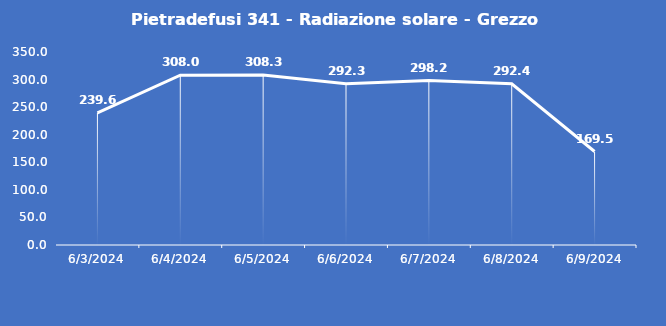
| Category | Pietradefusi 341 - Radiazione solare - Grezzo (W/m2) |
|---|---|
| 6/3/24 | 239.6 |
| 6/4/24 | 308 |
| 6/5/24 | 308.3 |
| 6/6/24 | 292.3 |
| 6/7/24 | 298.2 |
| 6/8/24 | 292.4 |
| 6/9/24 | 169.5 |